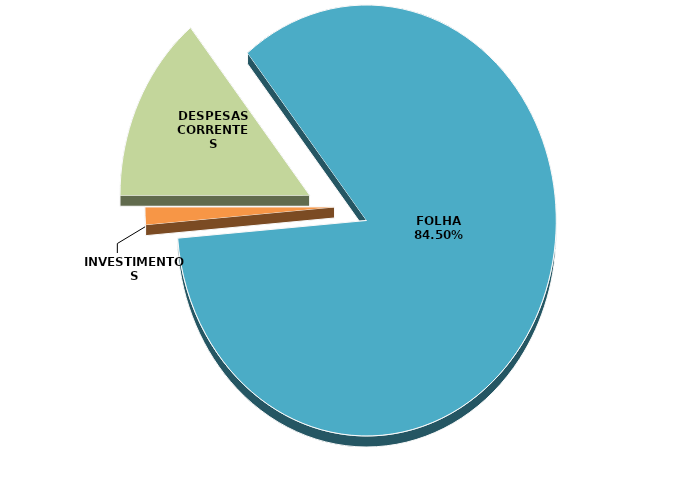
| Category | Series 0 | Series 1 |
|---|---|---|
| DESPESAS CORRENTES | 44083553.07 | 0.142 |
| FOLHA | 262569397 | 0.845 |
| INVESTIMENTOS | 4064684.45 | 0.013 |